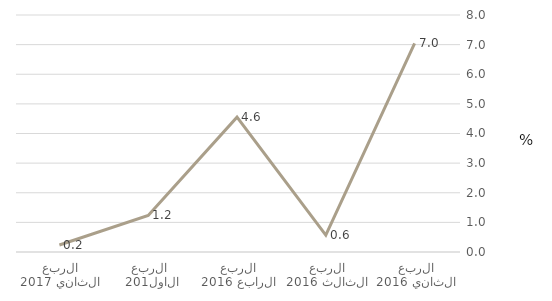
| Category | الأنشطة المالية وأنشطة التأمين |
|---|---|
| الربع الثاني 2016 | 7.039 |
| الربع الثالث 2016 | 0.569 |
| الربع الرابع 2016 | 4.551 |
| الربع الاول 2017 | 1.233 |
| الربع الثاني 2017 | 0.236 |